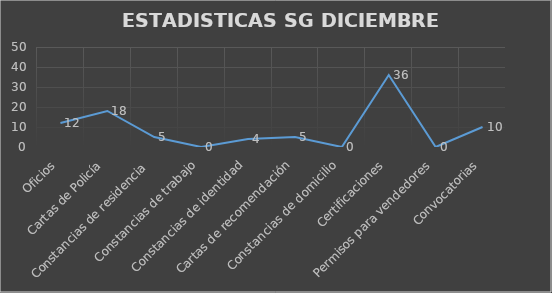
| Category | CANTIDAD |
|---|---|
| Oficios | 12 |
| Cartas de Policía | 18 |
| Constancias de residencia  | 5 |
| Constancias de trabajo | 0 |
| Constancias de identidad | 4 |
| Cartas de recomendación | 5 |
| Constancias de domicilio | 0 |
| Certificaciones | 36 |
| Permisos para vendedores | 0 |
| Convocatorias | 10 |